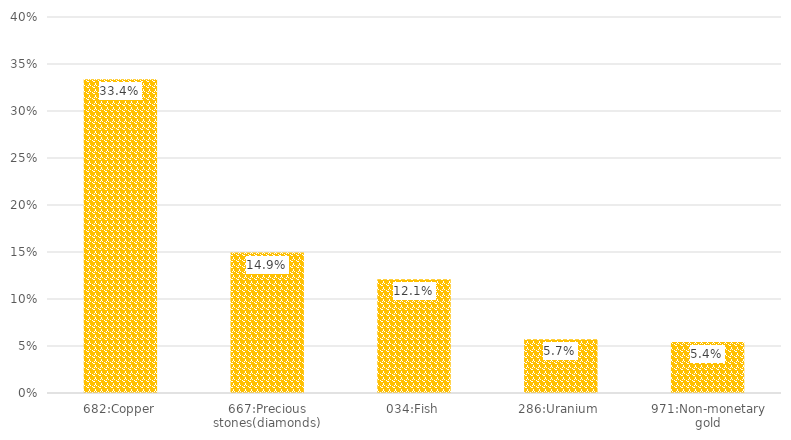
| Category | 44275 %Share |
|---|---|
| 682:Copper | 0.334 |
| 667:Precious stones(diamonds) | 0.149 |
| 034:Fish | 0.121 |
| 286:Uranium  | 0.057 |
| 971:Non-monetary gold | 0.054 |